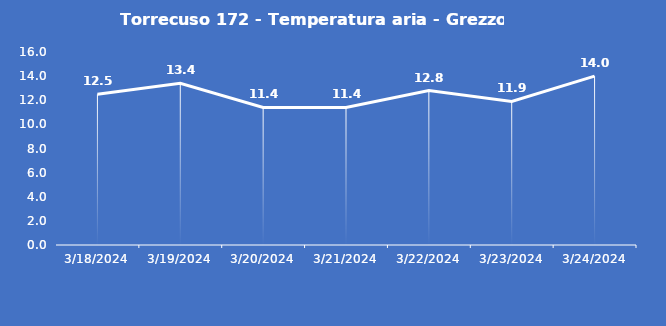
| Category | Torrecuso 172 - Temperatura aria - Grezzo (°C) |
|---|---|
| 3/18/24 | 12.5 |
| 3/19/24 | 13.4 |
| 3/20/24 | 11.4 |
| 3/21/24 | 11.4 |
| 3/22/24 | 12.8 |
| 3/23/24 | 11.9 |
| 3/24/24 | 14 |